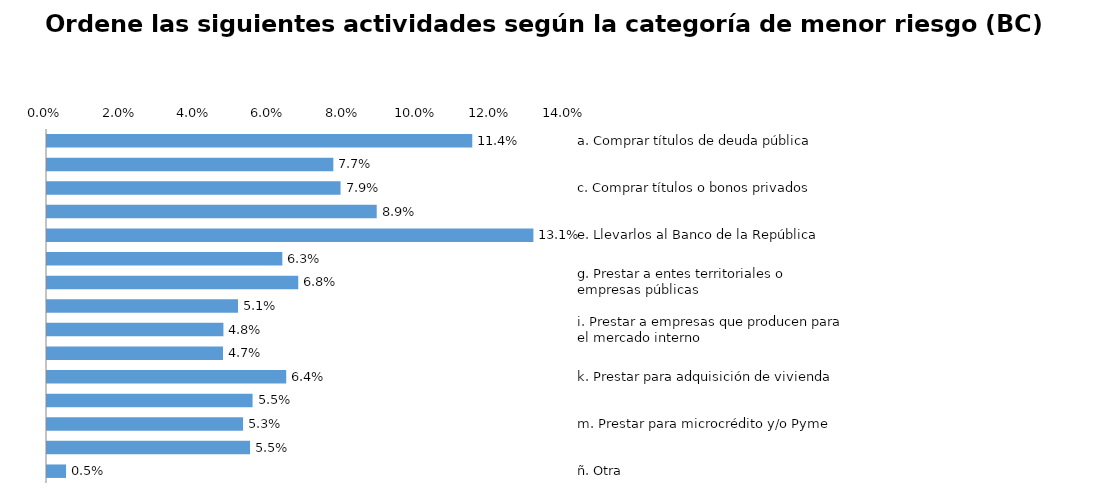
| Category | Series 0 |
|---|---|
| a. Comprar títulos de deuda pública | 0.114 |
| b. Comprar títulos o bonos hipotecarios | 0.077 |
| c. Comprar títulos o bonos privados | 0.079 |
| d. Prestar a entidades financieras | 0.089 |
| e. Llevarlos al Banco de la República | 0.131 |
| f.  Prestar a empresas con inversión extranjera | 0.063 |
| g. Prestar a entes territoriales o empresas públicas | 0.068 |
| h. Prestar para consumo | 0.051 |
| i. Prestar a empresas que producen para el mercado interno | 0.048 |
| j. Prestar a constructores | 0.047 |
| k. Prestar para adquisición de vivienda | 0.064 |
| l. Prestar a empresas que producen en una alta proporción para el mercado externo | 0.055 |
| m. Prestar para microcrédito y/o Pyme | 0.053 |
| n. Aumentar la posición propia en moneda extranjera | 0.055 |
| ñ. Otra | 0.005 |